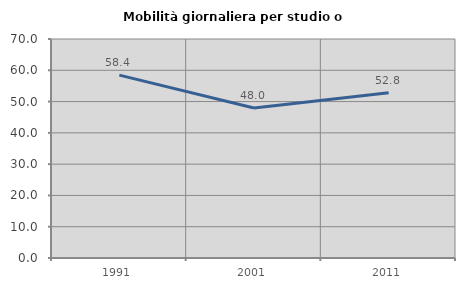
| Category | Mobilità giornaliera per studio o lavoro |
|---|---|
| 1991.0 | 58.441 |
| 2001.0 | 47.971 |
| 2011.0 | 52.848 |